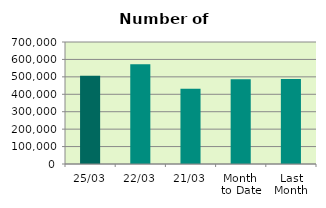
| Category | Series 0 |
|---|---|
| 25/03 | 505976 |
| 22/03 | 572978 |
| 21/03 | 431710 |
| Month 
to Date | 485754.353 |
| Last
Month | 488116.6 |